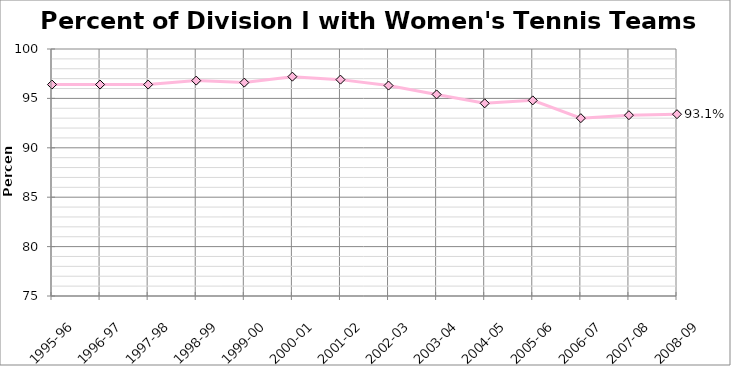
| Category | Women's |
|---|---|
| 1995-96 | 96.4 |
| 1996-97 | 96.4 |
| 1997-98 | 96.4 |
| 1998-99 | 96.8 |
| 1999-00 | 96.6 |
| 2000-01 | 97.2 |
| 2001-02 | 96.9 |
| 2002-03 | 96.3 |
| 2003-04 | 95.4 |
| 2004-05 | 94.5 |
| 2005-06 | 94.8 |
| 2006-07 | 93 |
| 2007-08 | 93.3 |
| 2008-09 | 93.4 |